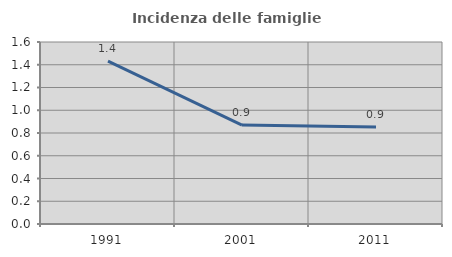
| Category | Incidenza delle famiglie numerose |
|---|---|
| 1991.0 | 1.432 |
| 2001.0 | 0.87 |
| 2011.0 | 0.853 |